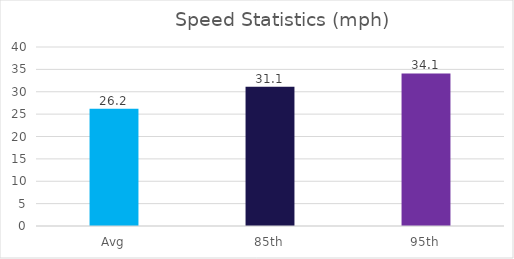
| Category | Series 0 |
|---|---|
| Avg | 26.2 |
| 85th | 31.1 |
| 95th | 34.1 |